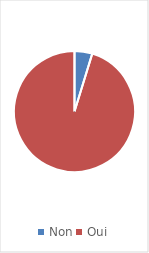
| Category | Series 0 |
|---|---|
| Non | 0.047 |
| Oui | 0.953 |